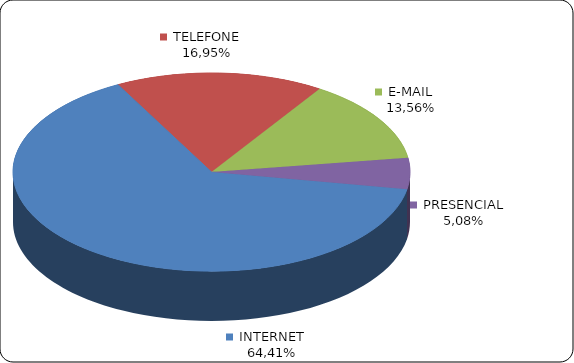
| Category | Series 0 |
|---|---|
|      INTERNET | 0.644 |
|      TELEFONE | 0.17 |
|      E-MAIL | 0.136 |
|      PRESENCIAL | 0.051 |